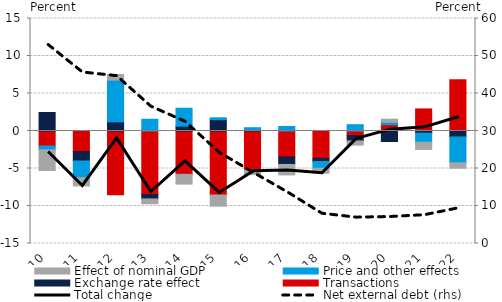
| Category | Transactions | Exchange rate effect | Price and other effects | Effect of nominal GDP  |
|---|---|---|---|---|
| 2010.0 | -1.998 | 2.468 | -0.513 | -2.755 |
| 2011.0 | -2.743 | -1.259 | -2.252 | -1.075 |
| 2012.0 | -8.512 | 1.223 | 5.559 | 0.749 |
| 2013.0 | -8.484 | -0.571 | 1.566 | -0.645 |
| 2014.0 | -5.778 | 0.638 | 2.399 | -1.3 |
| 2015.0 | -8.538 | 1.507 | 0.252 | -1.484 |
| 2016.0 | -5.233 | 0.205 | 0.236 | -0.582 |
| 2017.0 | -3.454 | -1.005 | 0.601 | -1.393 |
| 2018.0 | -3.642 | -0.43 | -0.891 | -0.664 |
| 2019.0 | -0.609 | -0.716 | 0.84 | -0.559 |
| 2020.0 | 0.846 | -1.398 | 0.33 | 0.4 |
| 2021.0 | 2.945 | -0.298 | -1.192 | -0.967 |
| 2022.0 | 6.832 | -0.792 | -3.448 | -0.725 |